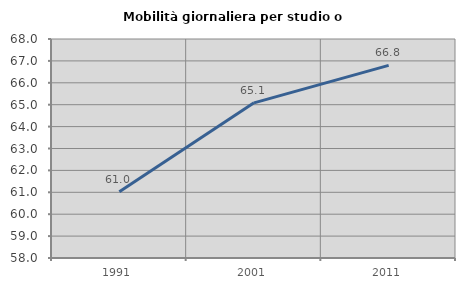
| Category | Mobilità giornaliera per studio o lavoro |
|---|---|
| 1991.0 | 61.024 |
| 2001.0 | 65.083 |
| 2011.0 | 66.795 |